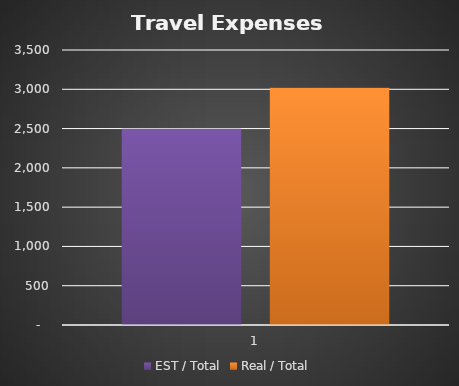
| Category | EST / Total  | Real / Total |
|---|---|---|
| 0 | 2498 | 3018 |